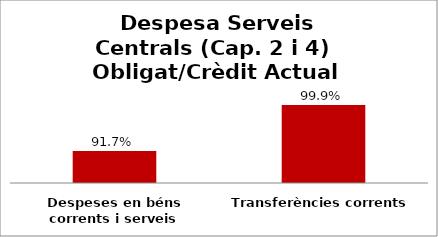
| Category | Series 0 |
|---|---|
| Despeses en béns corrents i serveis | 0.917 |
| Transferències corrents | 0.999 |